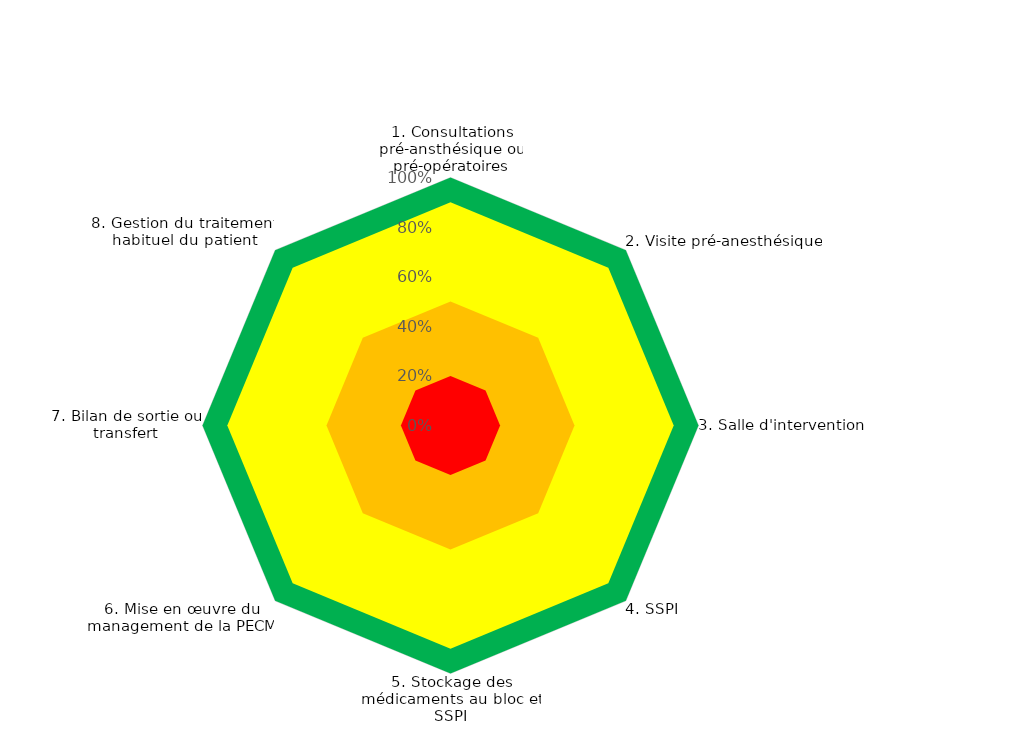
| Category | Series 1 | Zone 3 | Zone 2 | Zone 1 | Niveau de conformité |
|---|---|---|---|---|---|
| 1. Consultations pré-ansthésique ou pré-opératoires | 1 | 0.9 | 0.5 | 0.2 | 0 |
| 2. Visite pré-anesthésique | 1 | 0.9 | 0.5 | 0.2 | 0 |
| 3. Salle d'intervention | 1 | 0.9 | 0.5 | 0.2 | 0 |
| 4. SSPI | 1 | 0.9 | 0.5 | 0.2 | 0 |
| 5. Stockage des médicaments au bloc et SSPI | 1 | 0.9 | 0.5 | 0.2 | 0 |
| 6. Mise en œuvre du management de la PECM | 1 | 0.9 | 0.5 | 0.2 | 0 |
| 7. Bilan de sortie ou transfert | 1 | 0.9 | 0.5 | 0.2 | 0 |
| 8. Gestion du traitement habituel du patient | 1 | 0.9 | 0.5 | 0.2 | 0 |